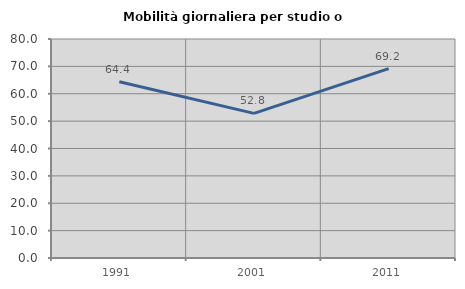
| Category | Mobilità giornaliera per studio o lavoro |
|---|---|
| 1991.0 | 64.384 |
| 2001.0 | 52.83 |
| 2011.0 | 69.17 |